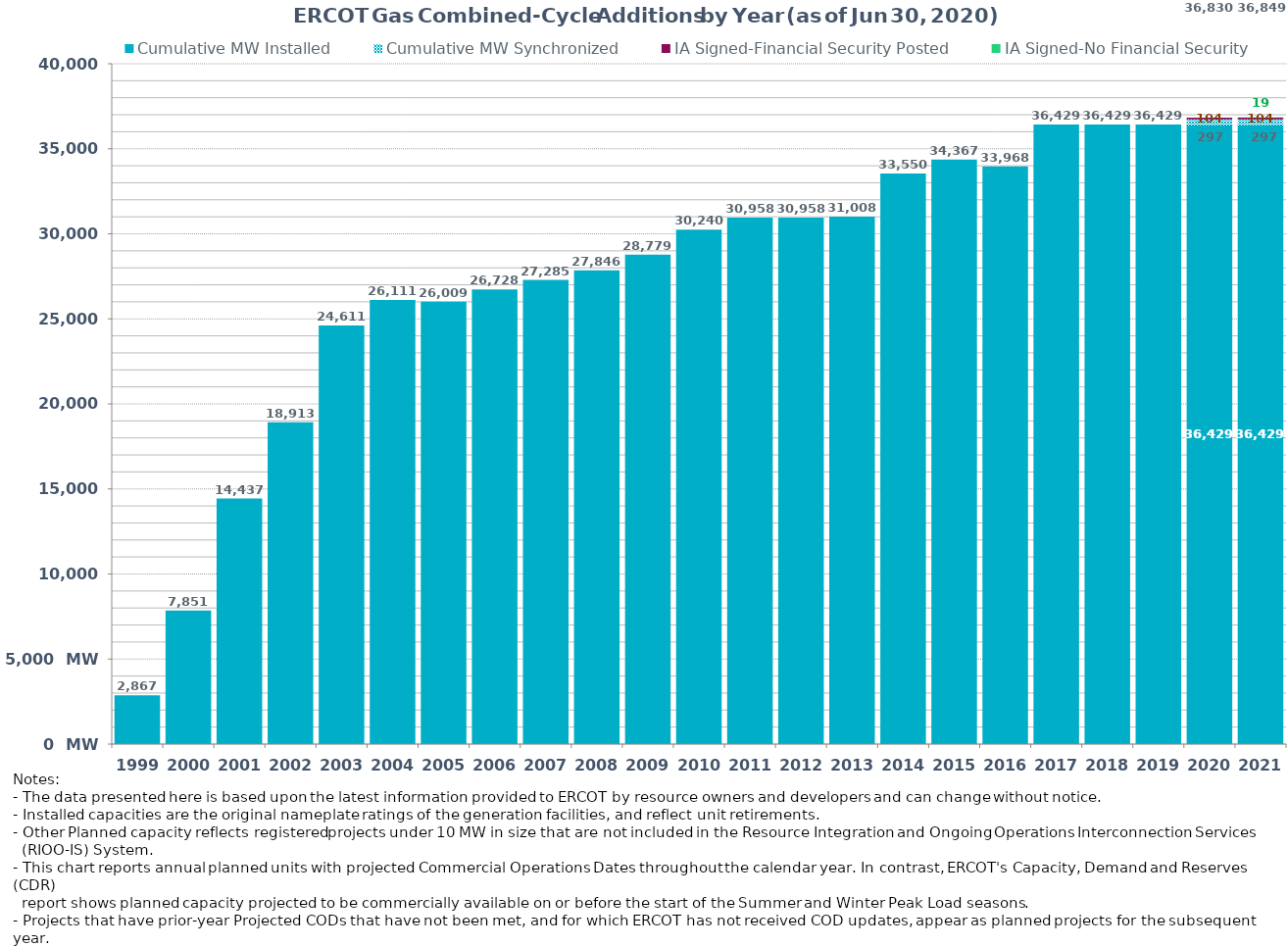
| Category | Cumulative MW Installed | Cumulative MW Synchronized | IA Signed-Financial Security Posted  | IA Signed-No Financial Security  | Other Planned | Cumulative Installed and Planned |
|---|---|---|---|---|---|---|
| 1999.0 | 2867 | 0 | 0 | 0 | 0 | 2867 |
| 2000.0 | 7851 | 0 | 0 | 0 | 0 | 7851 |
| 2001.0 | 14437 | 0 | 0 | 0 | 0 | 14437 |
| 2002.0 | 18913 | 0 | 0 | 0 | 0 | 18913 |
| 2003.0 | 24611 | 0 | 0 | 0 | 0 | 24611 |
| 2004.0 | 26111 | 0 | 0 | 0 | 0 | 26111 |
| 2005.0 | 26009 | 0 | 0 | 0 | 0 | 26009 |
| 2006.0 | 26728 | 0 | 0 | 0 | 0 | 26728 |
| 2007.0 | 27285 | 0 | 0 | 0 | 0 | 27285 |
| 2008.0 | 27846 | 0 | 0 | 0 | 0 | 27846 |
| 2009.0 | 28779 | 0 | 0 | 0 | 0 | 28779 |
| 2010.0 | 30240 | 0 | 0 | 0 | 0 | 30240 |
| 2011.0 | 30958 | 0 | 0 | 0 | 0 | 30958 |
| 2012.0 | 30958 | 0 | 0 | 0 | 0 | 30958 |
| 2013.0 | 31008 | 0 | 0 | 0 | 0 | 31008 |
| 2014.0 | 33550 | 0 | 0 | 0 | 0 | 33550 |
| 2015.0 | 34367 | 0 | 0 | 0 | 0 | 34367 |
| 2016.0 | 33968 | 0 | 0 | 0 | 0 | 33968 |
| 2017.0 | 36429 | 0 | 0 | 0 | 0 | 36429 |
| 2018.0 | 36429 | 0 | 0 | 0 | 0 | 36429 |
| 2019.0 | 36429 | 0 | 0 | 0 | 0 | 36429 |
| 2020.0 | 36429 | 297 | 104 | 0 | 0 | 36830 |
| 2021.0 | 36429 | 297 | 104 | 19 | 0 | 36849 |